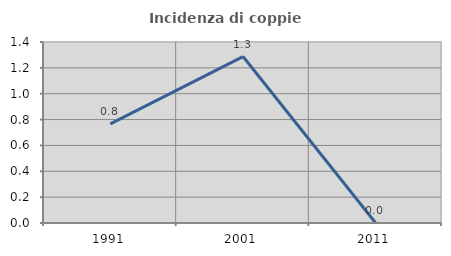
| Category | Incidenza di coppie miste |
|---|---|
| 1991.0 | 0.766 |
| 2001.0 | 1.288 |
| 2011.0 | 0 |